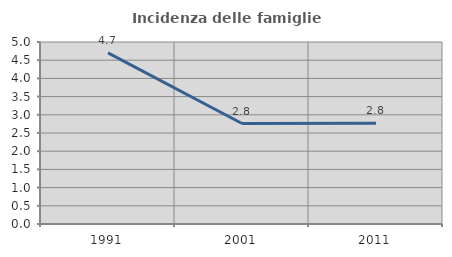
| Category | Incidenza delle famiglie numerose |
|---|---|
| 1991.0 | 4.701 |
| 2001.0 | 2.761 |
| 2011.0 | 2.765 |